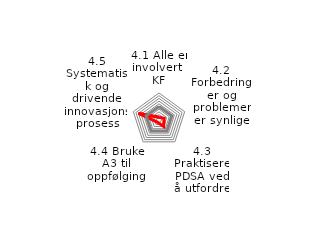
| Category | Series 0 | Series 1 |
|---|---|---|
| 4.1 Alle er involvert i KF | 1 | 5 |
| 4.2 Forbedringer og problemer er synlige | 2 | 5 |
| 4.3 Praktisere PDSA ved å utfordre | 3 | 5 |
| 4.4 Bruke A3 til oppfølging | 1 | 5 |
| 4.5 Systematisk og drivende innovasjonsprosess | 8 | 5 |